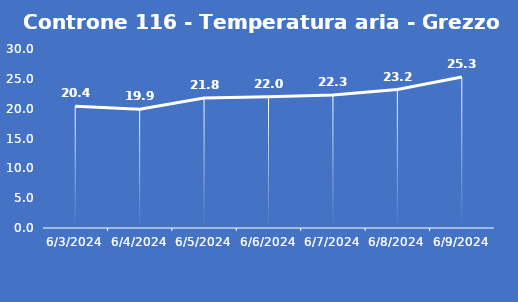
| Category | Controne 116 - Temperatura aria - Grezzo (°C) |
|---|---|
| 6/3/24 | 20.4 |
| 6/4/24 | 19.9 |
| 6/5/24 | 21.8 |
| 6/6/24 | 22 |
| 6/7/24 | 22.3 |
| 6/8/24 | 23.2 |
| 6/9/24 | 25.3 |